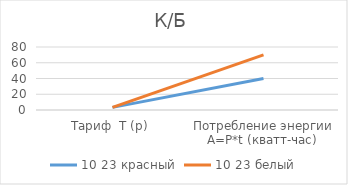
| Category | 10 |
|---|---|
| Тариф  Т (р) | 3.3 |
| Потребление энергии A=P*t (кватт-час) | 70 |